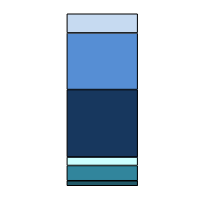
| Category | Series 0 | Series 1 | Series 2 | Series 3 | Series 4 | Series 5 |
|---|---|---|---|---|---|---|
| 0 | 150 | 456 | 254 | 2017 | 1694 | 573 |